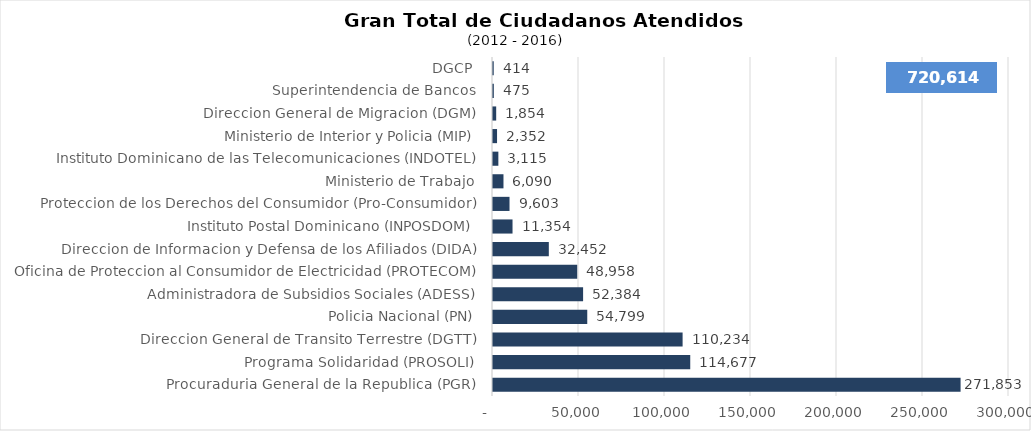
| Category | Series 0 |
|---|---|
| Procuraduria General de la Republica (PGR) | 271853 |
| Programa Solidaridad (PROSOLI) | 114677 |
| Direccion General de Transito Terrestre (DGTT) | 110234 |
| Policia Nacional (PN) | 54799 |
| Administradora de Subsidios Sociales (ADESS) | 52384 |
| Oficina de Proteccion al Consumidor de Electricidad (PROTECOM) | 48958 |
| Direccion de Informacion y Defensa de los Afiliados (DIDA) | 32452 |
| Instituto Postal Dominicano (INPOSDOM) | 11354 |
| Proteccion de los Derechos del Consumidor (Pro-Consumidor) | 9603 |
| Ministerio de Trabajo | 6090 |
| Instituto Dominicano de las Telecomunicaciones (INDOTEL) | 3115 |
| Ministerio de Interior y Policia (MIP) | 2352 |
| Direccion General de Migracion (DGM) | 1854 |
| Superintendencia de Bancos | 475 |
| DGCP | 414 |